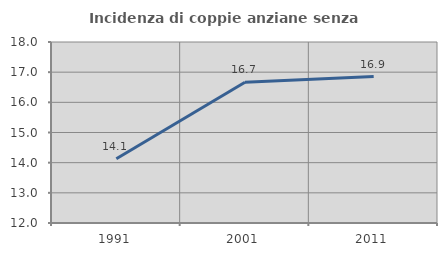
| Category | Incidenza di coppie anziane senza figli  |
|---|---|
| 1991.0 | 14.13 |
| 2001.0 | 16.667 |
| 2011.0 | 16.854 |